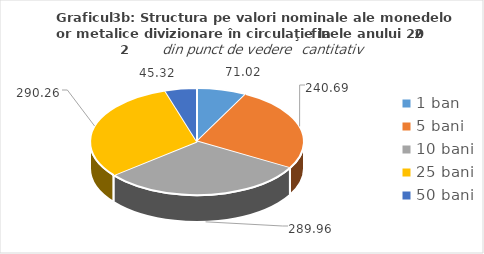
| Category | Series 0 |
|---|---|
| 1 ban | 71.02 |
| 5 bani | 240.69 |
| 10 bani | 289.96 |
| 25 bani | 290.26 |
| 50 bani | 45.32 |